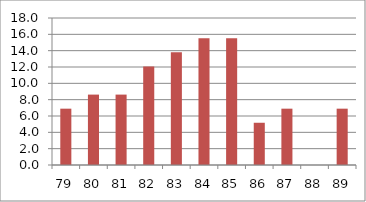
| Category | Series 1 |
|---|---|
| 79.0 | 6.897 |
| 80.0 | 8.621 |
| 81.0 | 8.621 |
| 82.0 | 12.069 |
| 83.0 | 13.793 |
| 84.0 | 15.517 |
| 85.0 | 15.517 |
| 86.0 | 5.172 |
| 87.0 | 6.897 |
| 88.0 | 0 |
| 89.0 | 6.897 |